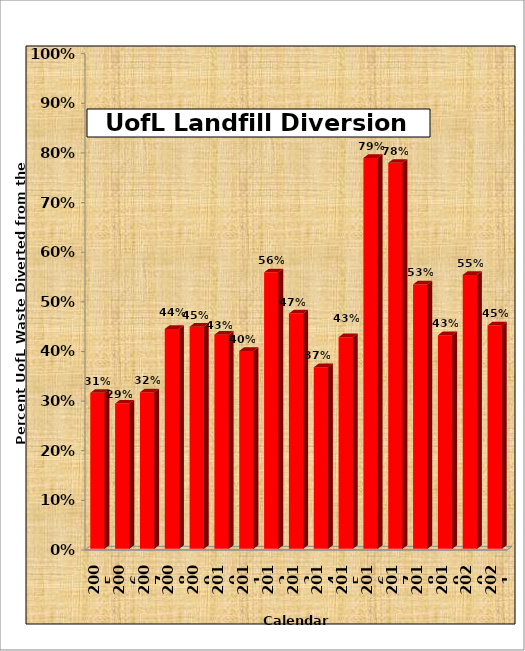
| Category | Calendar Year |
|---|---|
| 2021 | 0.45 |
| 2020 | 0.552 |
| 2019 | 0.43 |
| 2018 | 0.533 |
| 2017 | 0.778 |
| 2016 | 0.788 |
| 2015 | 0.427 |
| 2014 | 0.366 |
| 2013 | 0.474 |
| 2012 | 0.557 |
| 2011 | 0.399 |
| 2010 | 0.432 |
| 2009 | 0.448 |
| 2008 | 0.443 |
| 2007 | 0.315 |
| 2006 | 0.293 |
| 2005 | 0.314 |